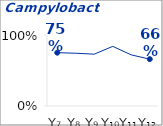
| Category | Campylobacter 2b |
|---|---|
| Y₇ | 0.751 |
| Y₈ | 0.743 |
| Y₉ | 0.73 |
| Y₁₀ | 0.84 |
| Y₁₁ | 0.72 |
| Y₁₂ | 0.66 |